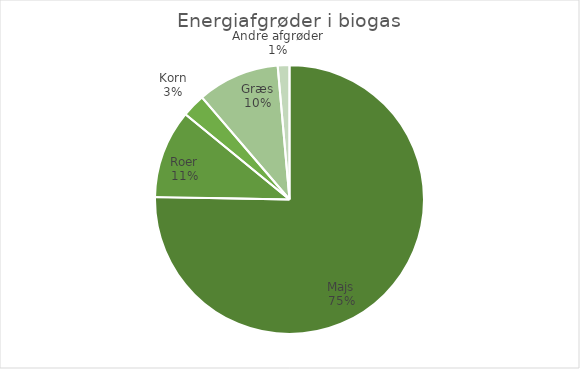
| Category | Series 0 |
|---|---|
| Majs | 189891.9 |
| Roer | 26783 |
| Korn | 7057.4 |
| Græs | 24904.8 |
| Andre afgrøder | 3551.5 |